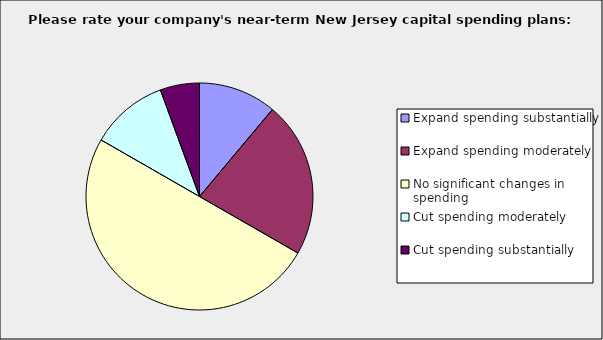
| Category | Series 0 |
|---|---|
| Expand spending substantially | 0.111 |
| Expand spending moderately | 0.222 |
| No significant changes in spending | 0.5 |
| Cut spending moderately | 0.111 |
| Cut spending substantially | 0.056 |